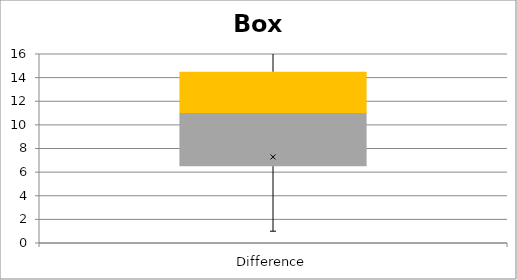
| Category | Min | Q1-Min | Med-Q1 | Q3-Med |
|---|---|---|---|---|
| Difference | 1 | 5.5 | 4.5 | 3.5 |